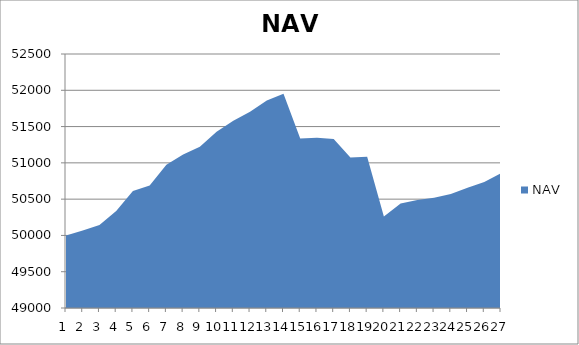
| Category | NAV |
|---|---|
| 0 | 50000 |
| 1 | 50069.444 |
| 2 | 50142.343 |
| 3 | 50336.57 |
| 4 | 50612.255 |
| 5 | 50687.913 |
| 6 | 50975.413 |
| 7 | 51115.874 |
| 8 | 51223.542 |
| 9 | 51427.364 |
| 10 | 51580.567 |
| 11 | 51704.692 |
| 12 | 51858.016 |
| 13 | 51951.766 |
| 14 | 51336.067 |
| 15 | 51345.356 |
| 16 | 51328.667 |
| 17 | 51072.985 |
| 18 | 51085.199 |
| 19 | 50261.67 |
| 20 | 50438.394 |
| 21 | 50489.896 |
| 22 | 50518.251 |
| 23 | 50572.468 |
| 24 | 50655.55 |
| 25 | 50737.787 |
| 26 | 50856.035 |